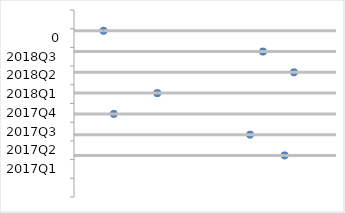
| Category | Categories |
|---|---|
|  | 72.877 |
| 2017Q1 | 0 |
| 2017Q2 | 0 |
| 2017Q3 | 0 |
| 2017Q4 | 0 |
| 2018Q1 | 0 |
| 2018Q2 | 0 |
| 2018Q3 | 0 |
| 0 | 0 |